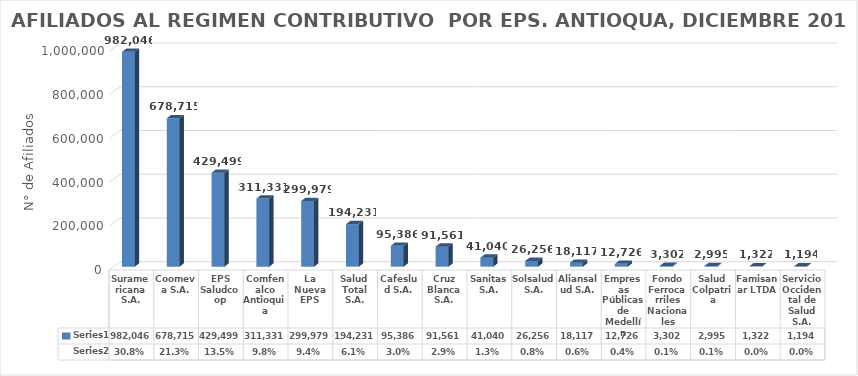
| Category | Series 0 | Series 1 |
|---|---|---|
| Suramericana S.A. | 982046 | 0.308 |
| Coomeva S.A. | 678715 | 0.213 |
| EPS Saludcoop | 429499 | 0.135 |
| Comfenalco Antioquia | 311331 | 0.098 |
| La Nueva EPS | 299979 | 0.094 |
| Salud Total S.A. | 194231 | 0.061 |
| Cafeslud S.A. | 95386 | 0.03 |
| Cruz Blanca S.A. | 91561 | 0.029 |
| Sanitas S.A. | 41040 | 0.013 |
| Solsalud S.A. | 26256 | 0.008 |
| Aliansalud S.A. | 18117 | 0.006 |
| Empresas Públicas de Medellín | 12726 | 0.004 |
| Fondo Ferrocarriles Nacionales | 3302 | 0.001 |
| Salud Colpatria | 2995 | 0.001 |
| Famisanar LTDA | 1322 | 0 |
| Servicio Occidental de Salud S.A. | 1194 | 0 |